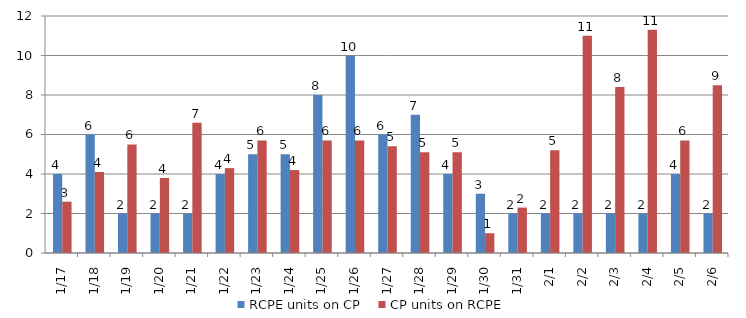
| Category | RCPE units on CP | CP units on RCPE |
|---|---|---|
| 2016-01-17 | 4 | 2.6 |
| 2016-01-18 | 6 | 4.1 |
| 2016-01-19 | 2 | 5.5 |
| 2016-01-20 | 2 | 3.8 |
| 2016-01-21 | 2 | 6.6 |
| 2016-01-22 | 4 | 4.3 |
| 2016-01-23 | 5 | 5.7 |
| 2016-01-24 | 5 | 4.2 |
| 2016-01-25 | 8 | 5.7 |
| 2016-01-26 | 10 | 5.7 |
| 2016-01-27 | 6 | 5.4 |
| 2016-01-28 | 7 | 5.1 |
| 2016-01-29 | 4 | 5.1 |
| 2016-01-30 | 3 | 1 |
| 2016-01-31 | 2 | 2.3 |
| 2016-02-01 | 2 | 5.2 |
| 2016-02-02 | 2 | 11 |
| 2016-02-03 | 2 | 8.4 |
| 2016-02-04 | 2 | 11.3 |
| 2016-02-05 | 4 | 5.7 |
| 2016-02-06 | 2 | 8.5 |